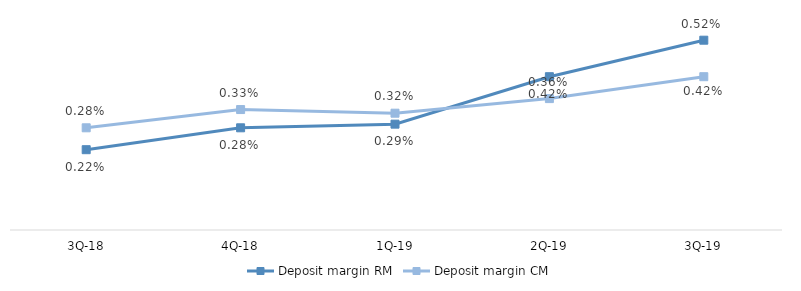
| Category | Deposit margin RM | Deposit margin CM |
|---|---|---|
| 3Q-19 | 0.005 | 0.004 |
| 2Q-19 | 0.004 | 0.004 |
| 1Q-19 | 0.003 | 0.003 |
| 4Q-18 | 0.003 | 0.003 |
| 3Q-18 | 0.002 | 0.003 |